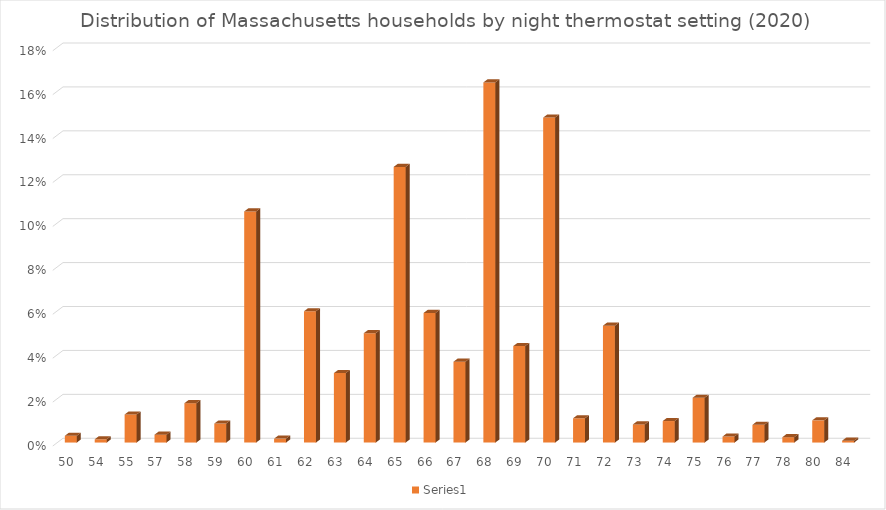
| Category | Series 1 |
|---|---|
| 50.0 | 0.003 |
| 54.0 | 0.001 |
| 55.0 | 0.013 |
| 57.0 | 0.004 |
| 58.0 | 0.018 |
| 59.0 | 0.009 |
| 60.0 | 0.105 |
| 61.0 | 0.002 |
| 62.0 | 0.06 |
| 63.0 | 0.032 |
| 64.0 | 0.05 |
| 65.0 | 0.126 |
| 66.0 | 0.059 |
| 67.0 | 0.037 |
| 68.0 | 0.164 |
| 69.0 | 0.044 |
| 70.0 | 0.148 |
| 71.0 | 0.011 |
| 72.0 | 0.053 |
| 73.0 | 0.008 |
| 74.0 | 0.01 |
| 75.0 | 0.02 |
| 76.0 | 0.003 |
| 77.0 | 0.008 |
| 78.0 | 0.002 |
| 80.0 | 0.01 |
| 84.0 | 0.001 |